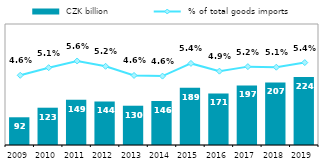
| Category |  CZK billion |
|---|---|
| 2009 | 91.653 |
| 2010 | 123.278 |
| 2011 | 149.274 |
| 2012 | 143.98 |
| 2013 | 129.839 |
| 2014 | 145.75 |
| 2015 | 189.009 |
| 2016 | 170.63 |
| 2017 | 196.963 |
| 2018 | 206.974 |
| 2019 | 224.436 |